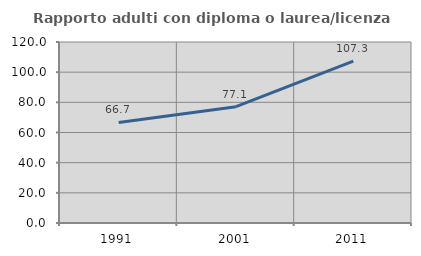
| Category | Rapporto adulti con diploma o laurea/licenza media  |
|---|---|
| 1991.0 | 66.667 |
| 2001.0 | 77.113 |
| 2011.0 | 107.261 |